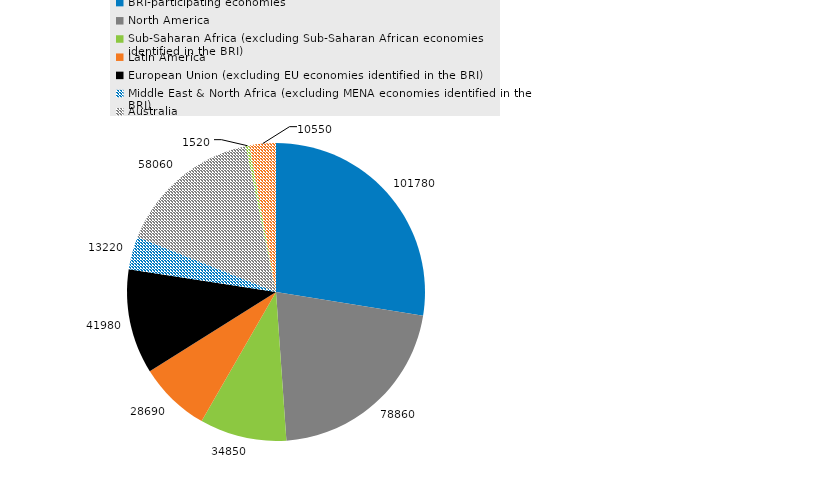
| Category | Series 0 |
|---|---|
| BRI-participating economies | 101780 |
| North America | 78860 |
| Sub-Saharan Africa (excluding Sub-Saharan African economies identified in the BRI) | 34850 |
| Latin America | 28690 |
| European Union (excluding EU economies identified in the BRI) | 41980 |
| Middle East & North Africa (excluding MENA economies identified in the BRI) | 13220 |
| Australia | 58060 |
| Japan | 1520 |
| Other economies | 10550 |